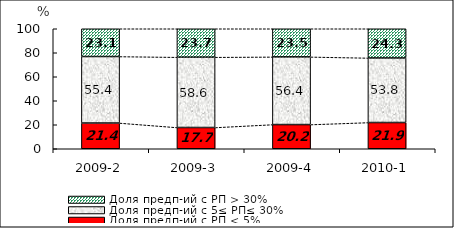
| Category | Доля предп-ий с РП < 5% | Доля предп-ий с 5≤ РП≤ 30% | Доля предп-ий с РП > 30% |
|---|---|---|---|
| 2009-2 | 21.436 | 55.434 | 23.131 |
| 2009-3 | 17.709 | 58.579 | 23.712 |
| 2009-4 | 20.166 | 56.376 | 23.457 |
| 2010-1 | 21.869 | 53.785 | 24.346 |